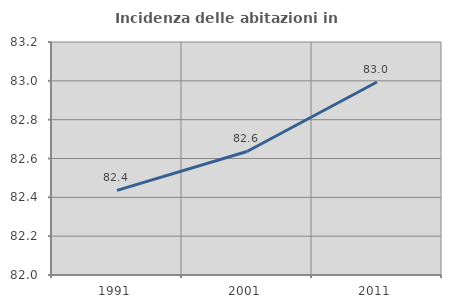
| Category | Incidenza delle abitazioni in proprietà  |
|---|---|
| 1991.0 | 82.436 |
| 2001.0 | 82.636 |
| 2011.0 | 82.994 |